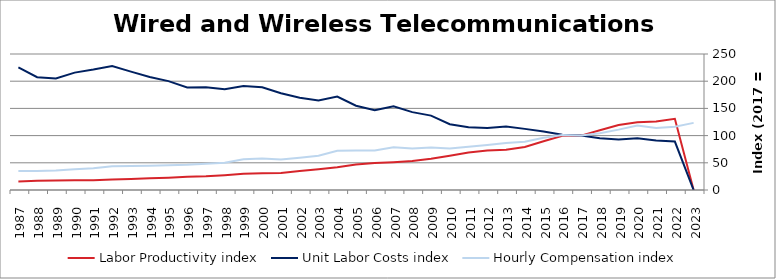
| Category | Labor Productivity index | Unit Labor Costs index | Hourly Compensation index |
|---|---|---|---|
| 2023.0 | 0 | 0 | 123.419 |
| 2022.0 | 130.782 | 89.03 | 116.435 |
| 2021.0 | 125.758 | 90.785 | 114.17 |
| 2020.0 | 124.67 | 95.153 | 118.627 |
| 2019.0 | 119.386 | 92.974 | 110.998 |
| 2018.0 | 109.69 | 95.049 | 104.26 |
| 2017.0 | 100 | 100 | 100 |
| 2016.0 | 99.622 | 101.512 | 101.128 |
| 2015.0 | 89.526 | 107.36 | 96.115 |
| 2014.0 | 79.036 | 112.35 | 88.797 |
| 2013.0 | 73.873 | 116.751 | 86.248 |
| 2012.0 | 72.769 | 113.907 | 82.889 |
| 2011.0 | 69.034 | 115.464 | 79.709 |
| 2010.0 | 62.895 | 120.993 | 76.099 |
| 2009.0 | 57.299 | 136.701 | 78.328 |
| 2008.0 | 53.382 | 143.108 | 76.394 |
| 2007.0 | 51.092 | 153.802 | 78.581 |
| 2006.0 | 49.451 | 146.769 | 72.578 |
| 2005.0 | 46.757 | 154.908 | 72.43 |
| 2004.0 | 41.973 | 171.807 | 72.113 |
| 2003.0 | 38.237 | 164.727 | 62.986 |
| 2002.0 | 35.039 | 169.744 | 59.477 |
| 2001.0 | 31.425 | 177.796 | 55.873 |
| 2000.0 | 30.676 | 188.713 | 57.89 |
| 1999.0 | 29.647 | 190.986 | 56.621 |
| 1998.0 | 27.184 | 185.056 | 50.306 |
| 1997.0 | 25.455 | 189.016 | 48.114 |
| 1996.0 | 24.526 | 188.459 | 46.221 |
| 1995.0 | 22.665 | 200.134 | 45.361 |
| 1994.0 | 21.503 | 207.66 | 44.654 |
| 1993.0 | 20.294 | 217.616 | 44.163 |
| 1992.0 | 19.22 | 227.957 | 43.813 |
| 1991.0 | 18.115 | 221.389 | 40.105 |
| 1990.0 | 17.744 | 215.744 | 38.282 |
| 1989.0 | 17.384 | 204.919 | 35.622 |
| 1988.0 | 16.905 | 207.452 | 35.071 |
| 1987.0 | 15.462 | 225.351 | 34.844 |